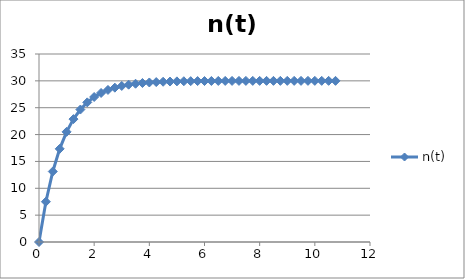
| Category | n(t) |
|---|---|
| 0.0 | 0 |
| 0.25 | 7.5 |
| 0.5 | 13.125 |
| 0.75 | 17.344 |
| 1.0 | 20.508 |
| 1.25 | 22.881 |
| 1.5 | 24.661 |
| 1.75 | 25.995 |
| 2.0 | 26.997 |
| 2.25 | 27.747 |
| 2.5 | 28.311 |
| 2.75 | 28.733 |
| 3.0 | 29.05 |
| 3.25 | 29.287 |
| 3.5 | 29.465 |
| 3.75 | 29.599 |
| 4.0 | 29.699 |
| 4.25 | 29.774 |
| 4.5 | 29.831 |
| 4.75 | 29.873 |
| 5.0 | 29.905 |
| 5.25 | 29.929 |
| 5.5 | 29.946 |
| 5.75 | 29.96 |
| 6.0 | 29.97 |
| 6.25 | 29.977 |
| 6.5 | 29.983 |
| 6.75 | 29.987 |
| 7.0 | 29.99 |
| 7.25 | 29.993 |
| 7.5 | 29.995 |
| 7.75 | 29.996 |
| 8.0 | 29.997 |
| 8.25 | 29.998 |
| 8.5 | 29.998 |
| 8.75 | 29.999 |
| 9.0 | 29.999 |
| 9.25 | 29.999 |
| 9.5 | 29.999 |
| 9.75 | 30 |
| 10.0 | 30 |
| 10.25 | 30 |
| 10.5 | 30 |
| 10.75 | 30 |